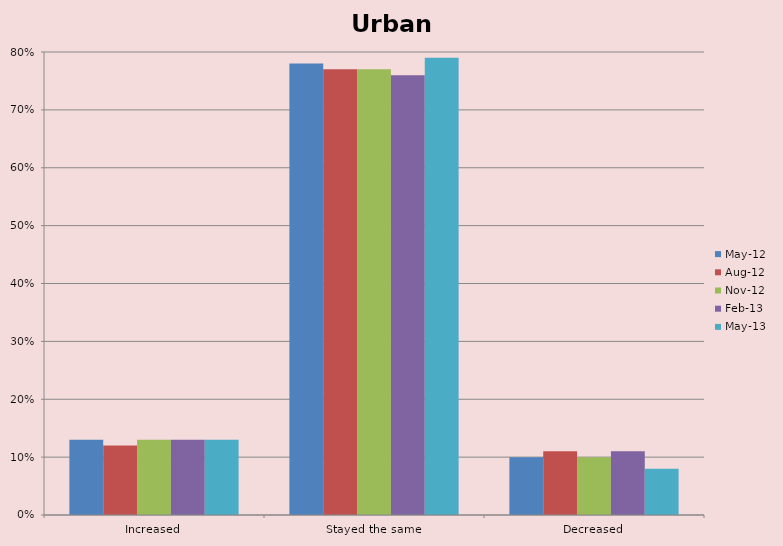
| Category | May-12 | Aug-12 | Nov-12 | Feb-13 | May-13 |
|---|---|---|---|---|---|
| Increased | 0.13 | 0.12 | 0.13 | 0.13 | 0.13 |
| Stayed the same | 0.78 | 0.77 | 0.77 | 0.76 | 0.79 |
| Decreased | 0.1 | 0.11 | 0.1 | 0.11 | 0.08 |